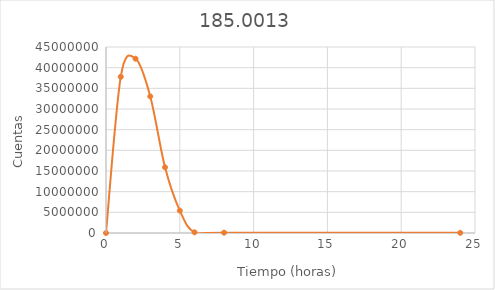
| Category | 185,0013 |
|---|---|
| 0.0 | 0 |
| 1.0 | 37783972 |
| 2.0 | 42171202 |
| 3.0 | 33039272 |
| 4.0 | 15896513 |
| 5.0 | 5420023 |
| 6.0 | 160408 |
| 8.0 | 74493 |
| 24.0 | 37322 |